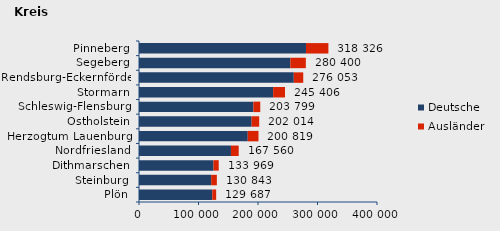
| Category | Deutsche | Ausländer | Series 2 |
|---|---|---|---|
| Plön | 123191 | 6496 | 129687 |
| Steinburg | 121308 | 9535 | 130843 |
| Dithmarschen | 125198 | 8771 | 133969 |
| Nordfriesland | 154533 | 13027 | 167560 |
| Herzogtum Lauenburg | 182799 | 18020 | 200819 |
| Ostholstein | 189287 | 12727 | 202014 |
| Schleswig-Flensburg | 192254 | 11545 | 203799 |
| Stormarn | 225408 | 19998 | 245406 |
| Rendsburg-Eckernförde | 260156 | 15897 | 276053 |
| Segeberg | 254351 | 26049 | 280400 |
| Pinneberg | 280638 | 37688 | 318326 |